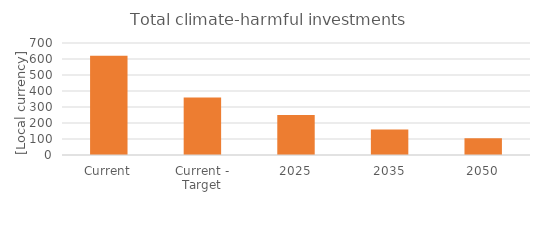
| Category | Climate-harmful investments |
|---|---|
| Current | 620 |
| Current - Target | 360 |
| 2025 | 250 |
| 2035 | 160 |
| 2050 | 105 |